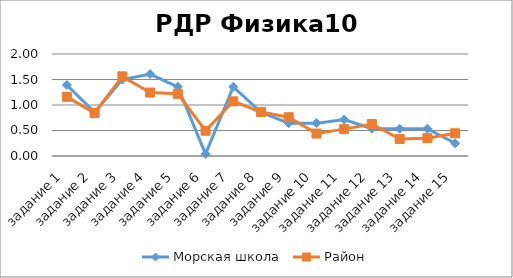
| Category | Морская школа | Район |
|---|---|---|
| задание 1 | 1.393 | 1.16 |
| задание 2 | 0.857 | 0.844 |
| задание 3 | 1.5 | 1.562 |
| задание 4 | 1.607 | 1.245 |
| задание 5 | 1.357 | 1.22 |
| задание 6 | 0.036 | 0.496 |
| задание 7 | 1.357 | 1.072 |
| задание 8 | 0.857 | 0.863 |
| задание 9 | 0.643 | 0.76 |
| задание 10 | 0.643 | 0.44 |
| задание 11 | 0.714 | 0.527 |
| задание 12 | 0.536 | 0.627 |
| задание 13 | 0.536 | 0.334 |
| задание 14 | 0.536 | 0.349 |
| задание 15 | 0.25 | 0.445 |